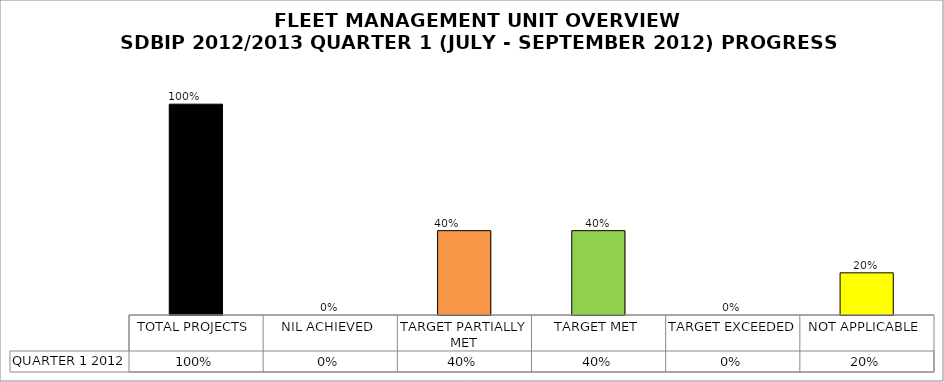
| Category | QUARTER 1 2012 |
|---|---|
| TOTAL PROJECTS | 1 |
| NIL ACHIEVED | 0 |
| TARGET PARTIALLY MET | 0.4 |
| TARGET MET | 0.4 |
| TARGET EXCEEDED | 0 |
| NOT APPLICABLE | 0.2 |